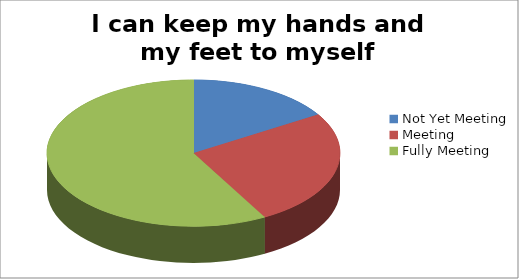
| Category | I can keep my hands and my feet to myself |
|---|---|
| Not Yet Meeting | 5 |
| Meeting | 8 |
| Fully Meeting | 18 |